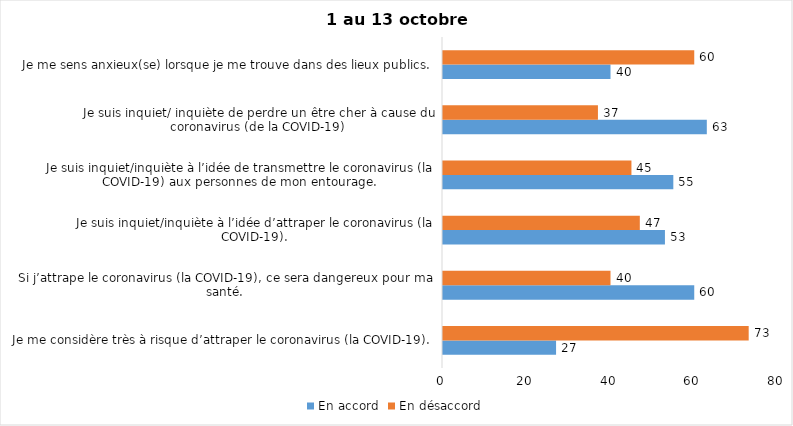
| Category | En accord | En désaccord |
|---|---|---|
| Je me considère très à risque d’attraper le coronavirus (la COVID-19). | 27 | 73 |
| Si j’attrape le coronavirus (la COVID-19), ce sera dangereux pour ma santé. | 60 | 40 |
| Je suis inquiet/inquiète à l’idée d’attraper le coronavirus (la COVID-19). | 53 | 47 |
| Je suis inquiet/inquiète à l’idée de transmettre le coronavirus (la COVID-19) aux personnes de mon entourage. | 55 | 45 |
| Je suis inquiet/ inquiète de perdre un être cher à cause du coronavirus (de la COVID-19) | 63 | 37 |
| Je me sens anxieux(se) lorsque je me trouve dans des lieux publics. | 40 | 60 |